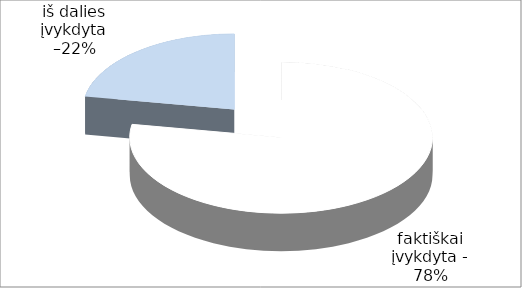
| Category | Series 0 |
|---|---|
| 0 | 7 |
| 1 | 2 |